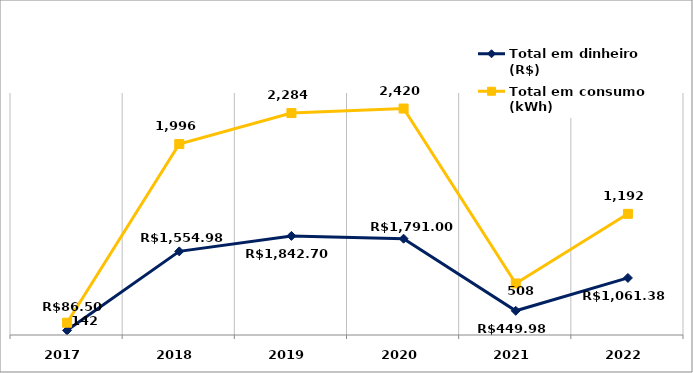
| Category | Total em dinheiro (R$) | Total em consumo (kWh) |
|---|---|---|
| 2017.0 | 86.5 | 142 |
| 2018.0 | 1554.98 | 1996 |
| 2019.0 | 1842.7 | 2284 |
| 2020.0 | 1791 | 2420 |
| 2021.0 | 449.98 | 508 |
| 2022.0 | 1061.38 | 1192 |